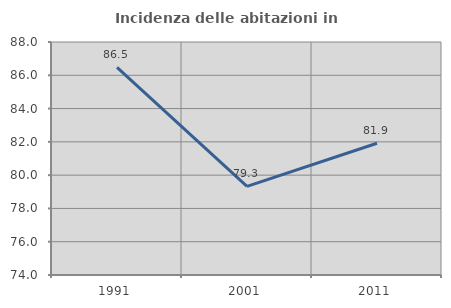
| Category | Incidenza delle abitazioni in proprietà  |
|---|---|
| 1991.0 | 86.477 |
| 2001.0 | 79.322 |
| 2011.0 | 81.915 |